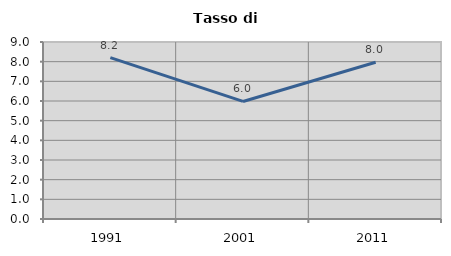
| Category | Tasso di disoccupazione   |
|---|---|
| 1991.0 | 8.209 |
| 2001.0 | 5.977 |
| 2011.0 | 7.968 |